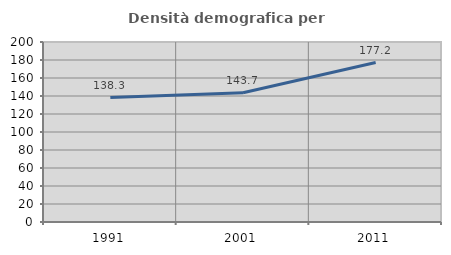
| Category | Densità demografica |
|---|---|
| 1991.0 | 138.327 |
| 2001.0 | 143.661 |
| 2011.0 | 177.213 |